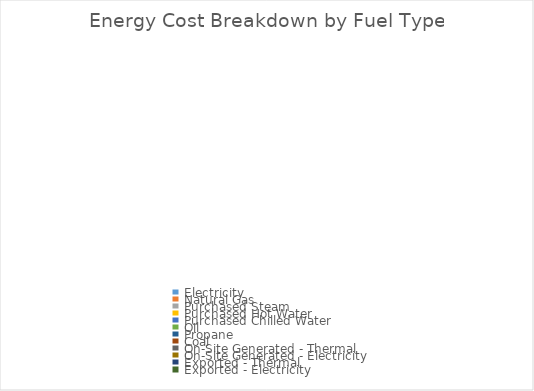
| Category | Series 0 |
|---|---|
| Electricity | 0 |
| Natural Gas | 0 |
| Purchased Steam | 0 |
| Purchased Hot Water | 0 |
| Purchased Chilled Water | 0 |
| Oil | 0 |
| Propane | 0 |
| Coal | 0 |
| On-Site Generated - Thermal | 0 |
| On-Site Generated - Electricity | 0 |
| Exported - Thermal | 0 |
| Exported - Electricity | 0 |